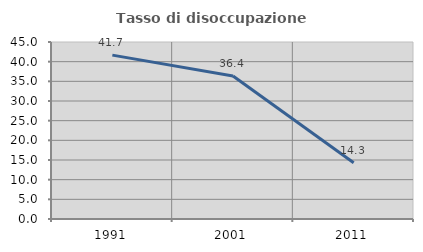
| Category | Tasso di disoccupazione giovanile  |
|---|---|
| 1991.0 | 41.667 |
| 2001.0 | 36.364 |
| 2011.0 | 14.286 |